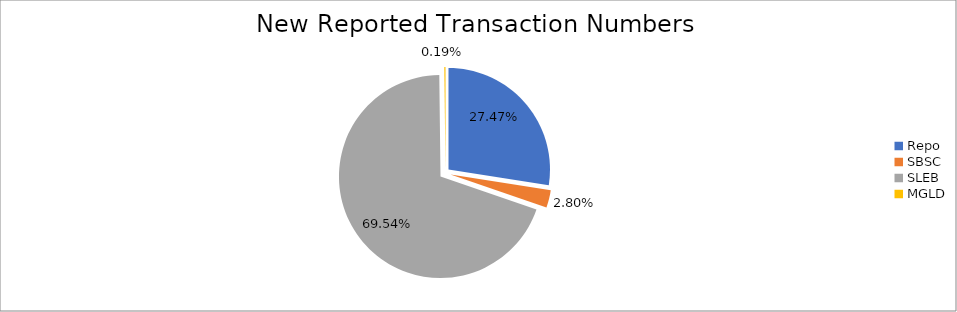
| Category | Series 0 |
|---|---|
| Repo | 381857 |
| SBSC | 38970 |
| SLEB | 966509 |
| MGLD | 2612 |